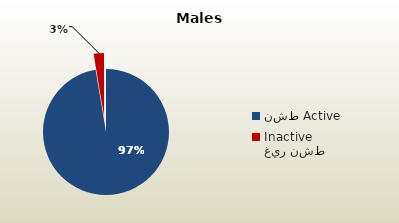
| Category | الذكور غير القطريين  Non-Qatari Males |
|---|---|
| نشط Active | 1787905 |
| غير نشط Inactive | 48514 |